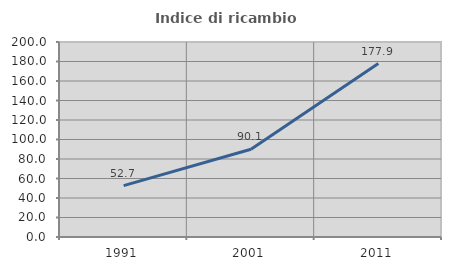
| Category | Indice di ricambio occupazionale  |
|---|---|
| 1991.0 | 52.671 |
| 2001.0 | 90.062 |
| 2011.0 | 177.936 |